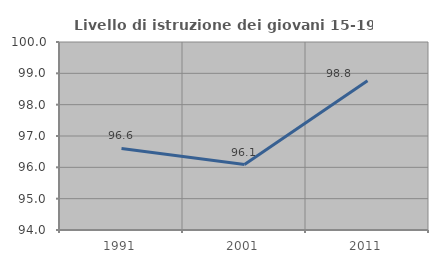
| Category | Livello di istruzione dei giovani 15-19 anni |
|---|---|
| 1991.0 | 96.604 |
| 2001.0 | 96.089 |
| 2011.0 | 98.765 |